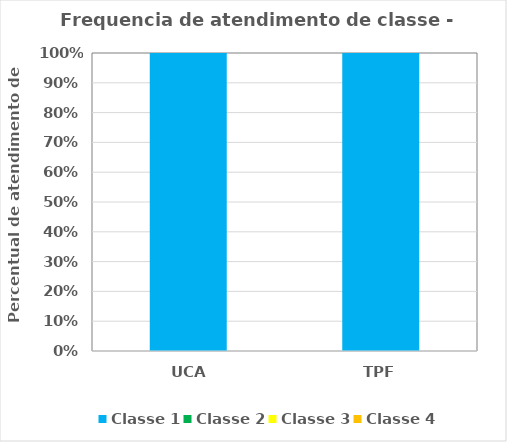
| Category | Classe 1 | Classe 2 | Classe 3 | Classe 4 |
|---|---|---|---|---|
| UCA | 1 | 0 | 0 | 0 |
| TPF | 1 | 0 | 0 | 0 |